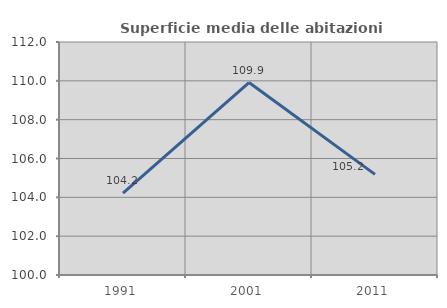
| Category | Superficie media delle abitazioni occupate |
|---|---|
| 1991.0 | 104.22 |
| 2001.0 | 109.912 |
| 2011.0 | 105.182 |